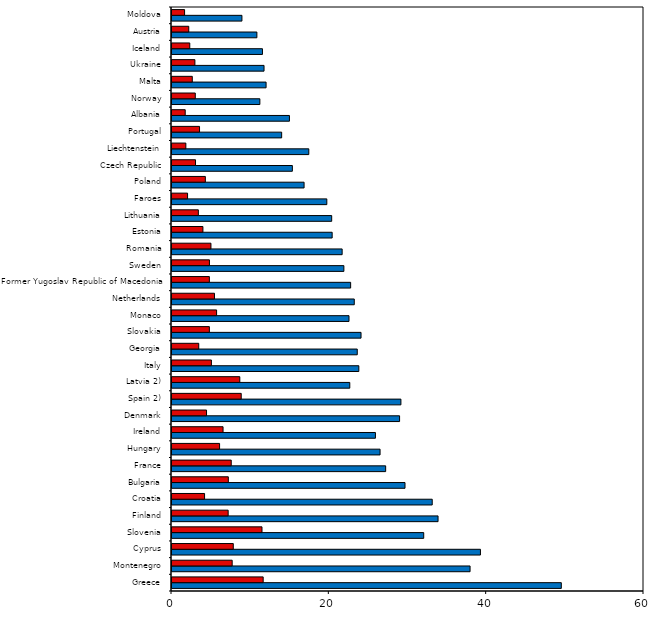
| Category | Boys | Girls |
|---|---|---|
| Greece | 49.49 | 11.59 |
| Montenegro | 37.89 | 7.65 |
| Cyprus | 39.21 | 7.79 |
| Slovenia | 32 | 11.44 |
| Finland | 33.82 | 7.14 |
| Croatia | 33.08 | 4.14 |
| Bulgaria | 29.62 | 7.16 |
| France | 27.16 | 7.53 |
| Hungary | 26.45 | 6.05 |
| Ireland | 25.86 | 6.49 |
| Denmark | 28.93 | 4.39 |
| Spain 2) | 29.1 | 8.8 |
| Latvia 2) | 22.6 | 8.62 |
| Italy | 23.75 | 5.01 |
| Georgia | 23.55 | 3.4 |
| Slovakia | 24.03 | 4.75 |
| Monaco | 22.5 | 5.67 |
| Netherlands | 23.17 | 5.4 |
| Former Yugoslav Republic of Macedonia | 22.71 | 4.75 |
| Sweden | 21.85 | 4.76 |
| Romania | 21.63 | 4.95 |
| Estonia | 20.36 | 3.93 |
| Lithuania | 20.3 | 3.35 |
| Faroes | 19.68 | 1.98 |
| Poland | 16.79 | 4.24 |
| Czech Republic | 15.3 | 2.99 |
| Liechtenstein | 17.39 | 1.76 |
| Portugal | 13.94 | 3.5 |
| Albania | 14.93 | 1.68 |
| Norway | 11.17 | 2.96 |
| Malta | 11.96 | 2.58 |
| Ukraine | 11.7 | 2.91 |
| Iceland | 11.5 | 2.26 |
| Austria | 10.79 | 2.13 |
| Moldova | 8.89 | 1.6 |